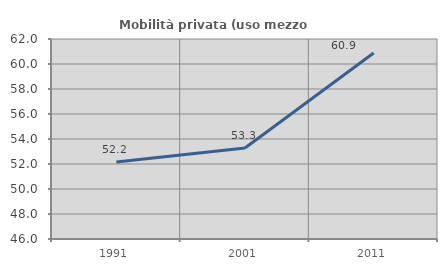
| Category | Mobilità privata (uso mezzo privato) |
|---|---|
| 1991.0 | 52.167 |
| 2001.0 | 53.284 |
| 2011.0 | 60.886 |